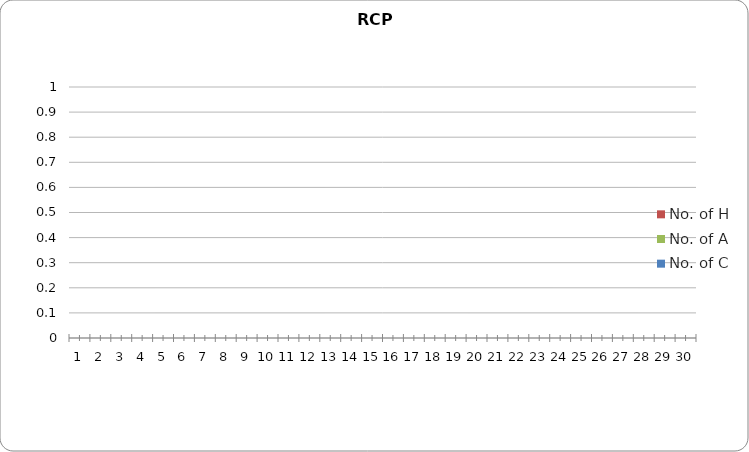
| Category | No. of H | No. of A | No. of C |
|---|---|---|---|
| 0 | 0 | 0 | 0 |
| 1 | 0 | 0 | 0 |
| 2 | 0 | 0 | 0 |
| 3 | 0 | 0 | 0 |
| 4 | 0 | 0 | 0 |
| 5 | 0 | 0 | 0 |
| 6 | 0 | 0 | 0 |
| 7 | 0 | 0 | 0 |
| 8 | 0 | 0 | 0 |
| 9 | 0 | 0 | 0 |
| 10 | 0 | 0 | 0 |
| 11 | 0 | 0 | 0 |
| 12 | 0 | 0 | 0 |
| 13 | 0 | 0 | 0 |
| 14 | 0 | 0 | 0 |
| 15 | 0 | 0 | 0 |
| 16 | 0 | 0 | 0 |
| 17 | 0 | 0 | 0 |
| 18 | 0 | 0 | 0 |
| 19 | 0 | 0 | 0 |
| 20 | 0 | 0 | 0 |
| 21 | 0 | 0 | 0 |
| 22 | 0 | 0 | 0 |
| 23 | 0 | 0 | 0 |
| 24 | 0 | 0 | 0 |
| 25 | 0 | 0 | 0 |
| 26 | 0 | 0 | 0 |
| 27 | 0 | 0 | 0 |
| 28 | 0 | 0 | 0 |
| 29 | 0 | 0 | 0 |